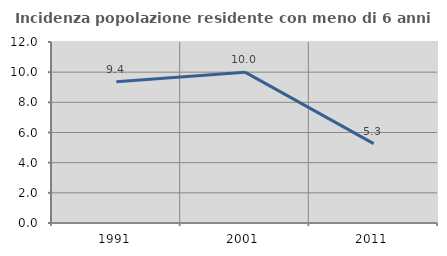
| Category | Incidenza popolazione residente con meno di 6 anni |
|---|---|
| 1991.0 | 9.365 |
| 2001.0 | 10 |
| 2011.0 | 5.263 |